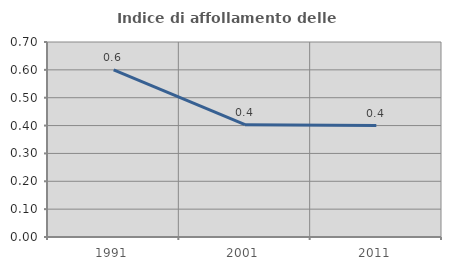
| Category | Indice di affollamento delle abitazioni  |
|---|---|
| 1991.0 | 0.6 |
| 2001.0 | 0.403 |
| 2011.0 | 0.4 |